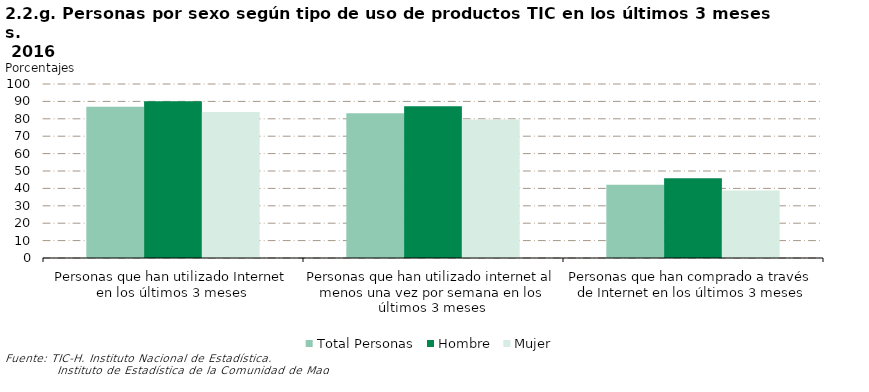
| Category | Total Personas | Hombre | Mujer |
|---|---|---|---|
| Personas que han utilizado Internet en los últimos 3 meses | 86.857 | 90.022 | 83.898 |
| Personas que han utilizado internet al menos una vez por semana en los últimos 3 meses | 83.233 | 87.162 | 79.559 |
| Personas que han comprado a través de Internet en los últimos 3 meses | 42.165 | 45.831 | 38.736 |